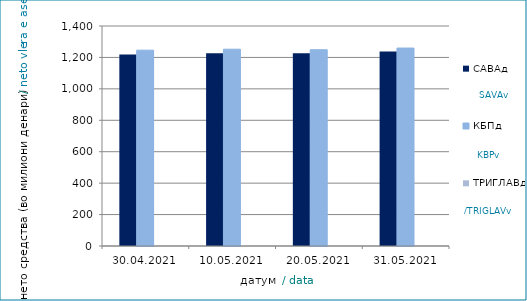
| Category | САВАд | КБПд | ТРИГЛАВд |
|---|---|---|---|
| 2021-04-30 | 1218.188 | 1246.271 | 0.36 |
| 2021-05-10 | 1225.977 | 1252.262 | 0.38 |
| 2021-05-20 | 1226.507 | 1248.893 | 0.409 |
| 2021-05-31 | 1237.8 | 1259.651 | 0.412 |